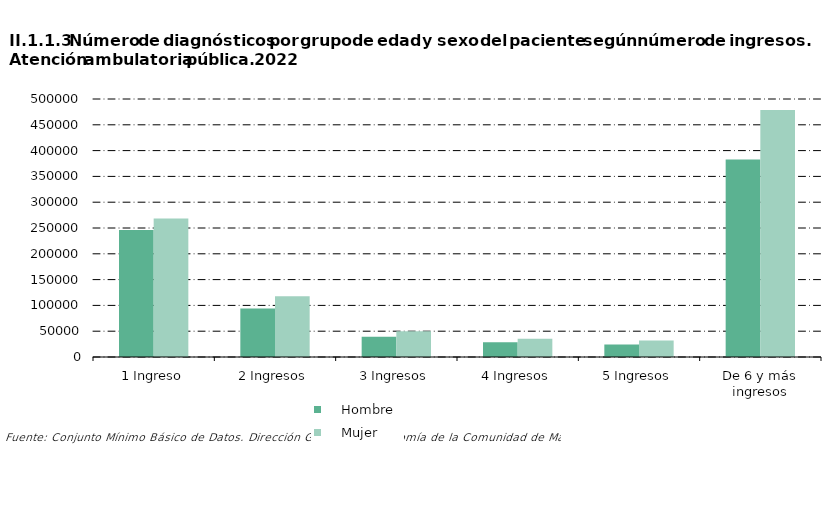
| Category |     Hombre |     Mujer |
|---|---|---|
| 1 Ingreso | 245987 | 268183 |
| 2 Ingresos | 93804 | 117705 |
| 3 Ingresos | 39439 | 49843 |
| 4 Ingresos | 28348 | 35283 |
| 5 Ingresos | 24459 | 31846 |
| De 6 y más ingresos | 382615 | 478679 |